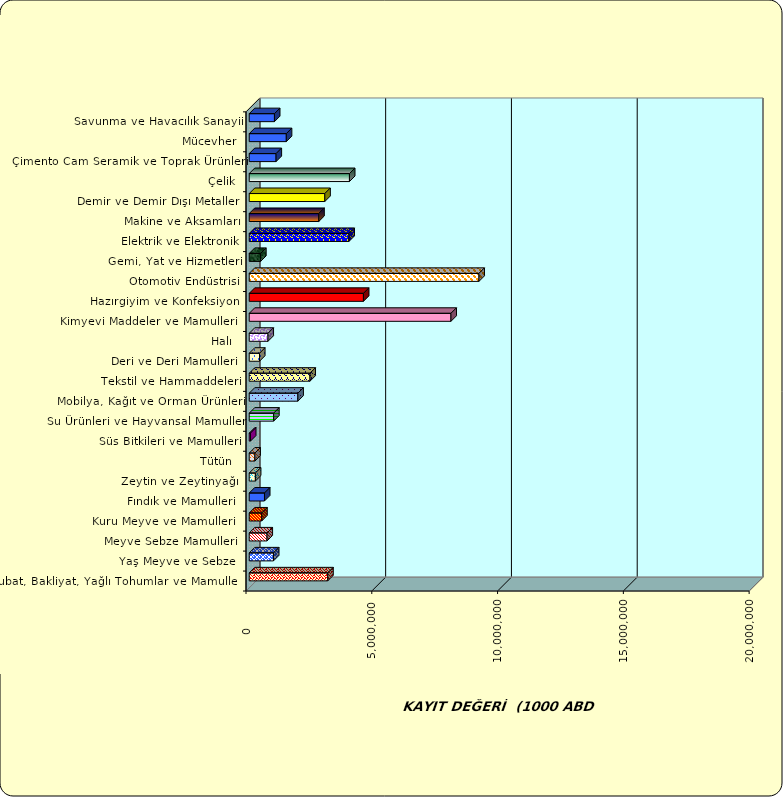
| Category | Series 0 |
|---|---|
|  Hububat, Bakliyat, Yağlı Tohumlar ve Mamulleri  | 3121888.731 |
|  Yaş Meyve ve Sebze   | 963595.37 |
|  Meyve Sebze Mamulleri  | 708255.016 |
|  Kuru Meyve ve Mamulleri   | 497639.842 |
|  Fındık ve Mamulleri  | 606041.41 |
|  Zeytin ve Zeytinyağı  | 245030.144 |
|  Tütün  | 224359.413 |
|  Süs Bitkileri ve Mamulleri | 49066.783 |
|  Su Ürünleri ve Hayvansal Mamuller | 970853.891 |
|  Mobilya, Kağıt ve Orman Ürünleri | 1933975.338 |
|  Tekstil ve Hammaddeleri | 2414591.307 |
|  Deri ve Deri Mamulleri  | 409533.202 |
|  Halı  | 746562.358 |
|  Kimyevi Maddeler ve Mamulleri   | 8019100.008 |
|  Hazırgiyim ve Konfeksiyon  | 4539462.616 |
|  Otomotiv Endüstrisi | 9132430.71 |
|  Gemi, Yat ve Hizmetleri | 452189.449 |
|  Elektrik ve Elektronik | 3964706.559 |
|  Makine ve Aksamları | 2764890.023 |
|  Demir ve Demir Dışı Metaller  | 3004891.319 |
|  Çelik | 3984116.755 |
|  Çimento Cam Seramik ve Toprak Ürünleri | 1067358.432 |
|  Mücevher | 1473936.509 |
|  Savunma ve Havacılık Sanayii | 1002559.249 |